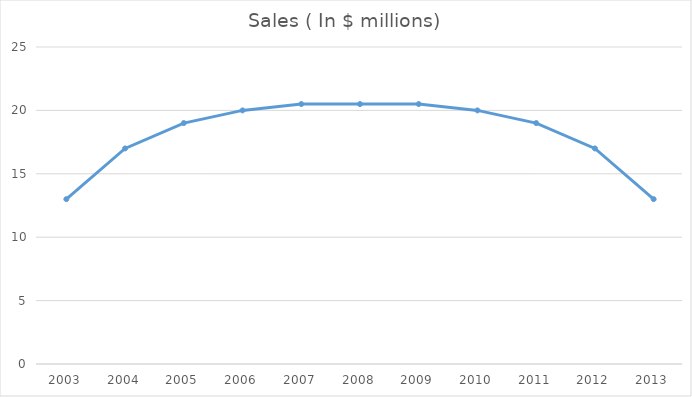
| Category | Sales ( In $ millions) |
|---|---|
| 2003.0 | 13 |
| 2004.0 | 17 |
| 2005.0 | 19 |
| 2006.0 | 20 |
| 2007.0 | 20.5 |
| 2008.0 | 20.5 |
| 2009.0 | 20.5 |
| 2010.0 | 20 |
| 2011.0 | 19 |
| 2012.0 | 17 |
| 2013.0 | 13 |